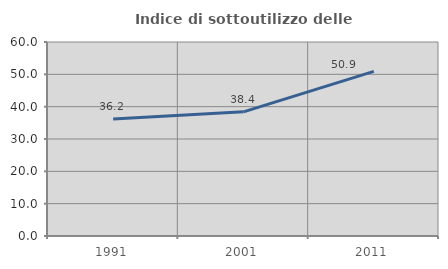
| Category | Indice di sottoutilizzo delle abitazioni  |
|---|---|
| 1991.0 | 36.22 |
| 2001.0 | 38.4 |
| 2011.0 | 50.926 |